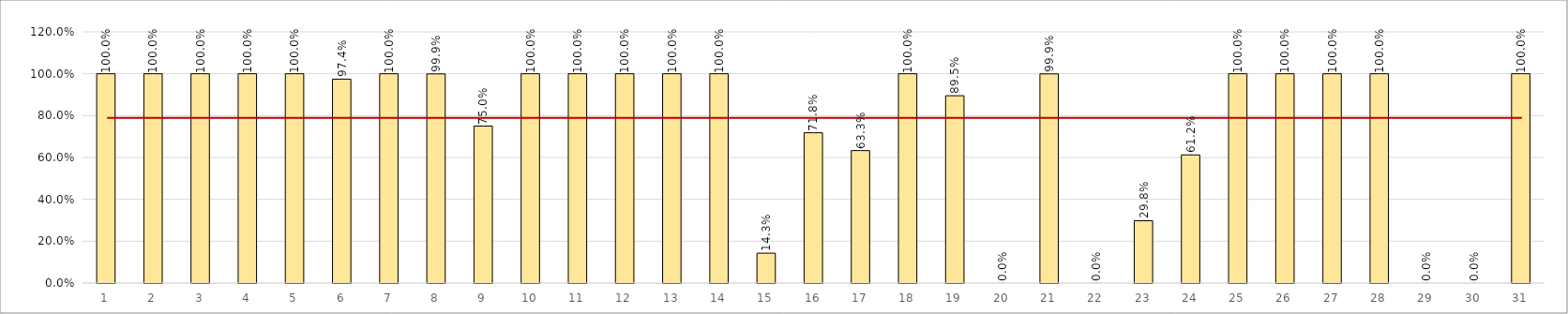
| Category | Series 1 |
|---|---|
| 1.0 | 1 |
| 2.0 | 1 |
| 3.0 | 1 |
| 4.0 | 1 |
| 5.0 | 1 |
| 6.0 | 0.974 |
| 7.0 | 1 |
| 8.0 | 0.999 |
| 9.0 | 0.75 |
| 10.0 | 1 |
| 11.0 | 1 |
| 12.0 | 1 |
| 13.0 | 1 |
| 14.0 | 1 |
| 15.0 | 0.143 |
| 16.0 | 0.718 |
| 17.0 | 0.633 |
| 18.0 | 1 |
| 19.0 | 0.895 |
| 20.0 | 0 |
| 21.0 | 0.999 |
| 22.0 | 0 |
| 23.0 | 0.298 |
| 24.0 | 0.612 |
| 25.0 | 1 |
| 26.0 | 1 |
| 27.0 | 1 |
| 28.0 | 1 |
| 29.0 | 0 |
| 30.0 | 0 |
| 31.0 | 1 |